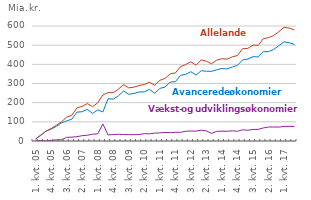
| Category | Avancerede økonomier | Vækst- og udviklingsøkonomier | Alle lande |
|---|---|---|---|
| 1. kvt. 05 | 10.6 | 0.3 | 10.9 |
| 2. kvt. 05 | 29 | 2.3 | 31.3 |
| 3. kvt. 05 | 51 | 0.9 | 51.9 |
| 4. kvt. 05 | 61.9 | 3.2 | 65.1 |
| 1. kvt. 06 | 76 | 5.9 | 81.9 |
| 2. kvt. 06 | 94.1 | 6.4 | 100.5 |
| 3. kvt. 06 | 104.9 | 19 | 123.9 |
| 4. kvt. 06 | 113.9 | 20.2 | 134.1 |
| 1. kvt. 07 | 150.6 | 22.5 | 173.1 |
| 2. kvt. 07 | 152.7 | 27.8 | 180.5 |
| 3. kvt. 07 | 165 | 30.2 | 195.2 |
| 4. kvt. 07 | 144 | 35.3 | 179.3 |
| 1. kvt. 08 | 162 | 37.1 | 199 |
| 2. kvt. 08 | 151.6 | 88.8 | 240.4 |
| 3. kvt. 08 | 220.5 | 31.9 | 252.4 |
| 4. kvt. 08 | 218.4 | 33.5 | 251.9 |
| 1. kvt. 09 | 235.6 | 35 | 270.6 |
| 2. kvt. 09 | 260.7 | 33.5 | 294.2 |
| 3. kvt. 09 | 243.9 | 33.2 | 277.1 |
| 4. kvt. 09 | 247.8 | 33.1 | 280.9 |
| 1. kvt. 10 | 255.7 | 33.7 | 289.5 |
| 2. kvt. 10 | 256.2 | 38.2 | 294.4 |
| 3. kvt. 10 | 269.7 | 37.5 | 307.3 |
| 4. kvt. 10 | 249.3 | 41.2 | 290.6 |
| 1. kvt. 11 | 274.4 | 42.2 | 316.6 |
| 2. kvt. 11 | 281.4 | 44.9 | 326.3 |
| 3. kvt. 11 | 307.2 | 43.4 | 350.6 |
| 4. kvt. 11 | 309.6 | 45.5 | 355.1 |
| 1. kvt. 12 | 342.6 | 45.1 | 387.7 |
| 2. kvt. 12 | 347.7 | 50.9 | 398.7 |
| 3. kvt. 12 | 361.5 | 52.1 | 413.6 |
| 4. kvt. 12 | 343.8 | 51.4 | 395.2 |
| 1. kvt. 13 | 366.7 | 56.4 | 423 |
| 2. kvt. 13 | 363.8 | 52.5 | 416.2 |
| 3. kvt. 13 | 363.7 | 39.4 | 403 |
| 4. kvt. 13 | 371.5 | 50.6 | 422.1 |
| 1. kvt. 14 | 378.1 | 51.2 | 429.2 |
| 2. kvt. 14 | 376.1 | 51 | 427.1 |
| 3. kvt. 14 | 386.2 | 52.9 | 439.1 |
| 4. kvt. 14 | 395 | 50.9 | 445.9 |
| 1. kvt. 15 | 423.1 | 58.3 | 481.4 |
| 2. kvt. 15 | 427.4 | 56 | 483.4 |
| 3. kvt. 15 | 440.1 | 60.2 | 500.3 |
| 4. kvt. 15 | 438.2 | 60.8 | 499 |
| 1. kvt. 16 | 465.9 | 68.1 | 534.1 |
| 2. kvt. 16 | 466.2 | 73 | 539.2 |
| 3. kvt. 16 | 478 | 73 | 551 |
| 4. kvt. 16 | 497.5 | 72.7 | 570.3 |
| 1. kvt. 17 | 517.4 | 76.1 | 593.5 |
| 2. kvt. 17 | 512.6 | 76.3 | 588.9 |
| 3. kvt. 17 | 503.5 | 76 | 579.5 |